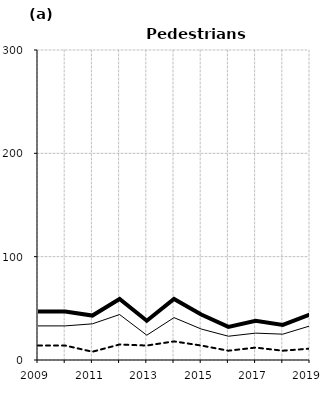
| Category | Built-up | Non built-up | Total |
|---|---|---|---|
| 2009.0 | 33 | 14 | 47 |
| 2010.0 | 33 | 14 | 47 |
| 2011.0 | 35 | 8 | 43 |
| 2012.0 | 44 | 15 | 59 |
| 2013.0 | 24 | 14 | 38 |
| 2014.0 | 41 | 18 | 59 |
| 2015.0 | 30 | 14 | 44 |
| 2016.0 | 23 | 9 | 32 |
| 2017.0 | 26 | 12 | 38 |
| 2018.0 | 25 | 9 | 34 |
| 2019.0 | 33 | 11 | 44 |